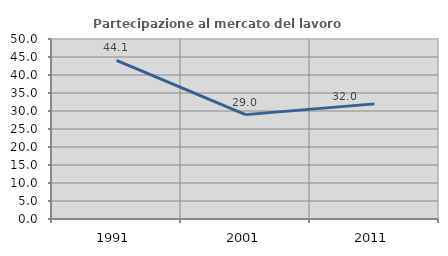
| Category | Partecipazione al mercato del lavoro  femminile |
|---|---|
| 1991.0 | 44.077 |
| 2001.0 | 28.994 |
| 2011.0 | 31.98 |